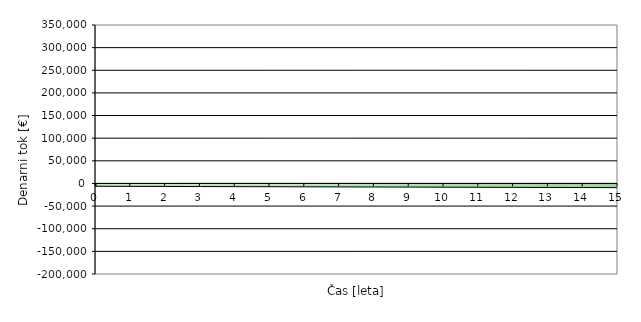
| Category | Series 0 |
|---|---|
| 0.0 | -6250 |
| 1.0 | -6448.447 |
| 2.0 | -6646.893 |
| 3.0 | -6845.34 |
| 4.0 | -7043.787 |
| 5.0 | -7242.233 |
| 6.0 | -7440.68 |
| 7.0 | -7639.127 |
| 8.0 | -7837.574 |
| 9.0 | -8036.02 |
| 10.0 | -8234.467 |
| 11.0 | -8432.914 |
| 12.0 | -8631.36 |
| 13.0 | -8829.807 |
| 14.0 | -9028.254 |
| 15.0 | -9226.7 |